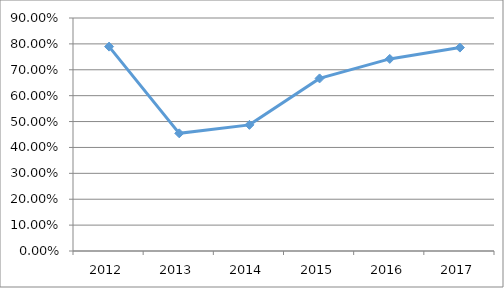
| Category | ESC2-I3O01 |
|---|---|
| 2012.0 | 0.789 |
| 2013.0 | 0.455 |
| 2014.0 | 0.487 |
| 2015.0 | 0.667 |
| 2016.0 | 0.742 |
| 2017.0 | 0.786 |